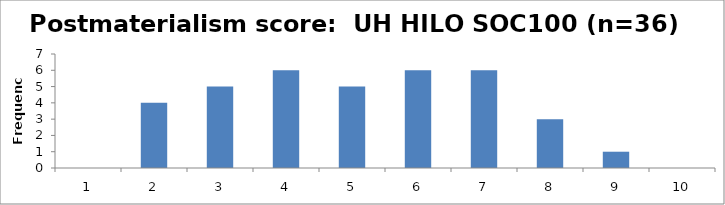
| Category | Frequency |
|---|---|
| 1.0 | 0 |
| 2.0 | 4 |
| 3.0 | 5 |
| 4.0 | 6 |
| 5.0 | 5 |
| 6.0 | 6 |
| 7.0 | 6 |
| 8.0 | 3 |
| 9.0 | 1 |
| 10.0 | 0 |